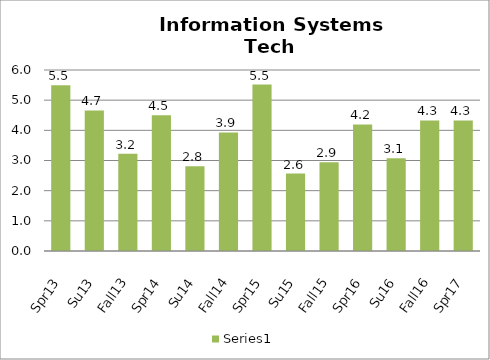
| Category | Series 2 |
|---|---|
| Spr13 | 5.497 |
| Su13 | 4.66 |
| Fall13 | 3.224 |
| Spr14 | 4.5 |
| Su14 | 2.811 |
| Fall14 | 3.931 |
| Spr15 | 5.519 |
| Su15 | 2.565 |
| Fall15 | 2.939 |
| Spr16 | 4.196 |
| Su16 | 3.077 |
| Fall16 | 4.328 |
| Spr17 | 4.328 |